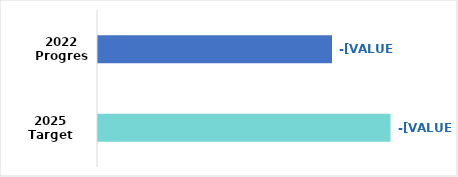
| Category | Series 0 |
|---|---|
| 2022 Progress | 0.25 |
| 2025 Target | 0.3 |